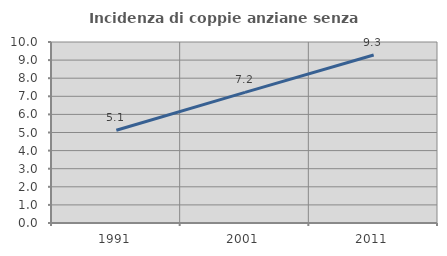
| Category | Incidenza di coppie anziane senza figli  |
|---|---|
| 1991.0 | 5.127 |
| 2001.0 | 7.214 |
| 2011.0 | 9.281 |